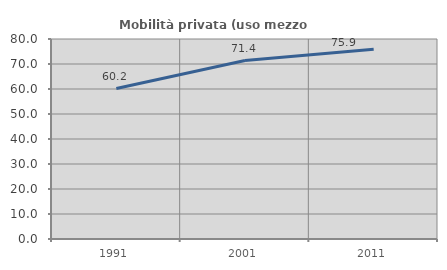
| Category | Mobilità privata (uso mezzo privato) |
|---|---|
| 1991.0 | 60.192 |
| 2001.0 | 71.365 |
| 2011.0 | 75.931 |